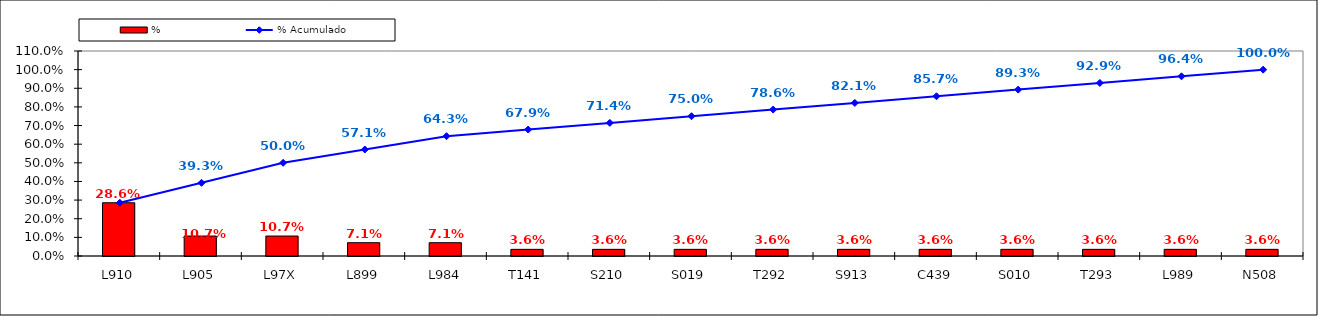
| Category | % |
|---|---|
| L910 | 0.286 |
| L905 | 0.107 |
| L97X | 0.107 |
| L899 | 0.071 |
| L984 | 0.071 |
| T141 | 0.036 |
| S210 | 0.036 |
| S019 | 0.036 |
| T292 | 0.036 |
| S913 | 0.036 |
| C439 | 0.036 |
| S010 | 0.036 |
| T293 | 0.036 |
| L989 | 0.036 |
| N508 | 0.036 |